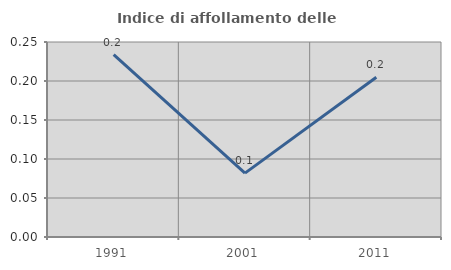
| Category | Indice di affollamento delle abitazioni  |
|---|---|
| 1991.0 | 0.234 |
| 2001.0 | 0.082 |
| 2011.0 | 0.205 |